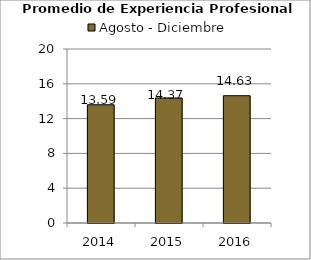
| Category | Agosto - Diciembre |
|---|---|
| 2014.0 | 13.59 |
| 2015.0 | 14.37 |
| 2016.0 | 14.63 |